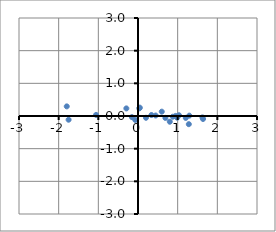
| Category | Series 0 |
|---|---|
| 0.0444725078338572 | 0.256 |
| 1.2045332128452542 | -0.058 |
| 0.9491875365733279 | 0.003 |
| 1.2811295901049577 | -0.25 |
| 1.0333198882704204 | 0.023 |
| 0.4447811792958796 | 0.015 |
| 1.6240529310948646 | -0.043 |
| 0.6910191341307528 | -0.059 |
| -5.744737503872925 | -0.377 |
| -0.06835017778349224 | -0.121 |
| -1.7496878492602348 | -0.114 |
| 0.33876607790170515 | 0.03 |
| 0.9871831399838209 | -0.052 |
| 0.20103757603517497 | -0.054 |
| -0.15318826322125773 | -0.034 |
| -1.0561554174926153 | 0.034 |
| 0.876681593229375 | -0.022 |
| 0.8018192472418372 | -0.175 |
| 1.6393188548072517 | -0.091 |
| -1.7960905633353643 | 0.294 |
| 0.599225140487022 | 0.133 |
| -3.182906300063177 | 0.188 |
| 0.03413993184310089 | 0.234 |
| -0.29345218591314476 | 0.233 |
| 1.2939007192636067 | 0.011 |